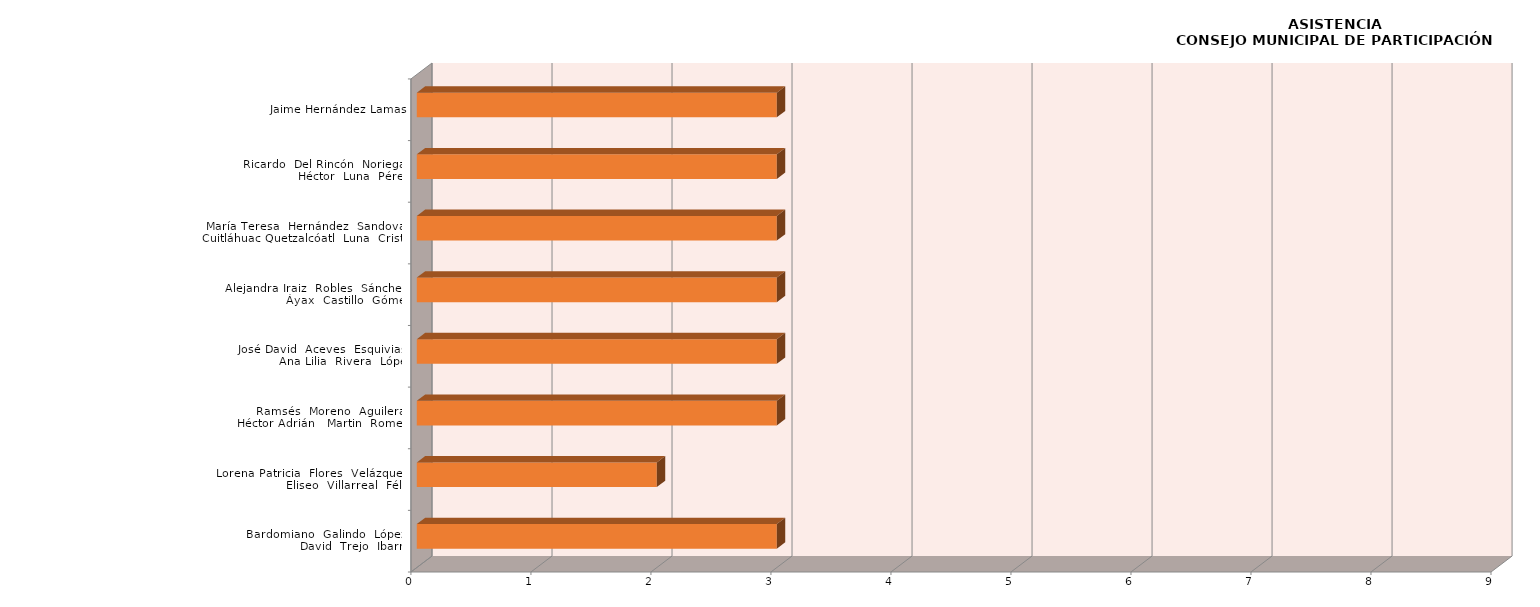
| Category | Series 1 |
|---|---|
| Bardomiano  Galindo  López /
David  Trejo  Ibarra | 3 |
| Lorena Patricia  Flores  Velázquez /
Eliseo  Villarreal  Félix | 2 |
| Ramsés  Moreno  Aguilera /
Héctor Adrián   Martin  Romero | 3 |
| José David  Aceves  Esquivias /
Ana Lilia  Rivera  López | 3 |
| Alejandra Iraiz  Robles  Sánchez /
Áyax  Castillo  Gómez | 3 |
| María Teresa  Hernández  Sandoval /
Cuitláhuac Quetzalcóatl  Luna  Cristal | 3 |
| Ricardo  Del Rincón  Noriega /
Héctor  Luna  Pérez | 3 |
| Jaime Hernández Lamas | 3 |